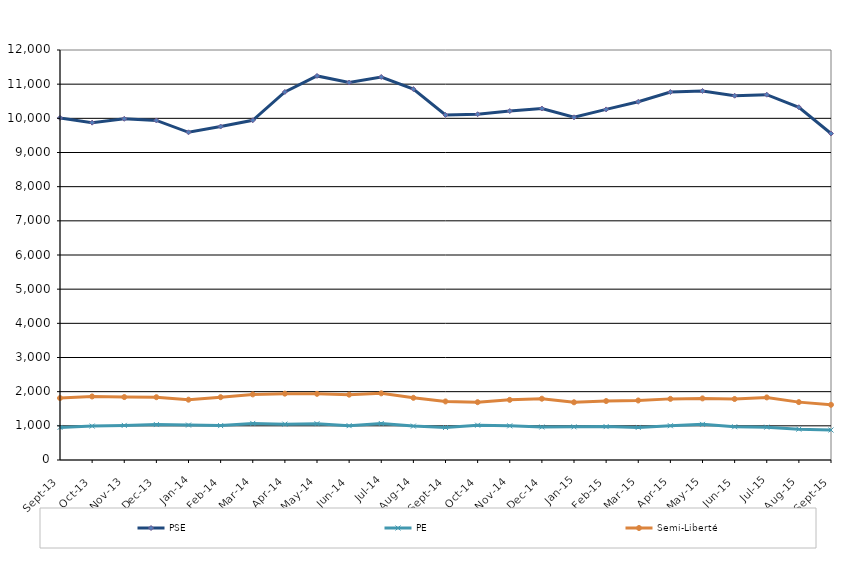
| Category | PSE | PE | Semi-Liberté |
|---|---|---|---|
| 2013-09-01 | 10013 | 954 | 1813 |
| 2013-10-01 | 9874 | 993 | 1860 |
| 2013-11-01 | 9987 | 1013 | 1842 |
| 2013-12-01 | 9938 | 1037 | 1838 |
| 2014-01-01 | 9591 | 1022 | 1765 |
| 2014-02-01 | 9760 | 1007 | 1838 |
| 2014-03-01 | 9943 | 1071 | 1920 |
| 2014-04-01 | 10773 | 1050 | 1942 |
| 2014-05-01 | 11241 | 1062 | 1937 |
| 2014-06-01 | 11048 | 1005 | 1912 |
| 2014-07-01 | 11210 | 1068 | 1951 |
| 2014-08-01 | 10856 | 992 | 1820 |
| 2014-09-01 | 10098 | 951 | 1714 |
| 2014-10-01 | 10120 | 1018 | 1692 |
| 2014-11-01 | 10213 | 1000 | 1760 |
| 2014-12-01 | 10287 | 966 | 1794 |
| 2015-01-01 | 10030 | 970 | 1689 |
| 2015-02-01 | 10261 | 977 | 1726 |
| 2015-03-01 | 10485 | 954 | 1742 |
| 2015-04-01 | 10770 | 1003 | 1789 |
| 2015-05-01 | 10801 | 1043 | 1803 |
| 2015-06-01 | 10662 | 973 | 1785 |
| 2015-07-01 | 10692 | 961 | 1832 |
| 2015-08-01 | 10325 | 903 | 1694 |
| 2015-09-01 | 9555 | 878 | 1616 |